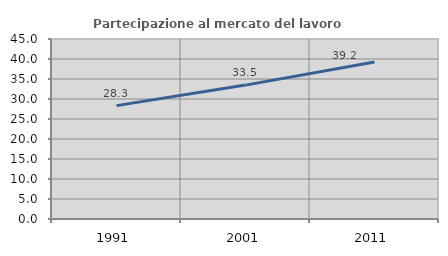
| Category | Partecipazione al mercato del lavoro  femminile |
|---|---|
| 1991.0 | 28.346 |
| 2001.0 | 33.475 |
| 2011.0 | 39.241 |